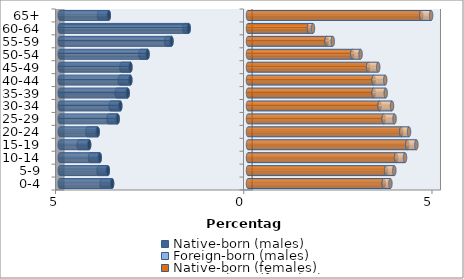
| Category | Native-born (males) | Foreign-born (males) | Native-born (females) | Foreign-born (females) |
|---|---|---|---|---|
| 0-4 | -3.611 | -0.277 | 3.605 | 0.178 |
| 5-9 | -3.725 | -0.246 | 3.668 | 0.218 |
| 10-14 | -3.939 | -0.257 | 3.932 | 0.239 |
| 15-19 | -4.22 | -0.28 | 4.232 | 0.241 |
| 20-24 | -3.993 | -0.274 | 4.072 | 0.205 |
| 25-29 | -3.463 | -0.24 | 3.603 | 0.289 |
| 30-34 | -3.393 | -0.253 | 3.495 | 0.33 |
| 35-39 | -3.196 | -0.291 | 3.338 | 0.32 |
| 40-44 | -3.126 | -0.28 | 3.337 | 0.308 |
| 45-49 | -3.124 | -0.236 | 3.19 | 0.269 |
| 50-54 | -2.669 | -0.189 | 2.769 | 0.221 |
| 55-59 | -2.033 | -0.141 | 2.088 | 0.163 |
| 60-64 | -1.576 | -0.113 | 1.62 | 0.106 |
| 65+ | -3.698 | -0.258 | 4.604 | 0.261 |